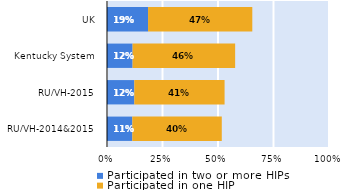
| Category | Participated in two or more HIPs | Participated in one HIP |
|---|---|---|
| RU/VH-2014&2015 | 0.114 | 0.403 |
| RU/VH-2015 | 0.123 | 0.407 |
| Kentucky System | 0.115 | 0.462 |
| UK | 0.185 | 0.47 |